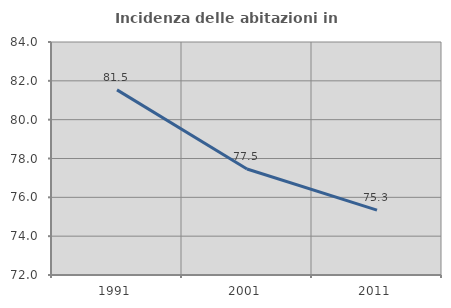
| Category | Incidenza delle abitazioni in proprietà  |
|---|---|
| 1991.0 | 81.534 |
| 2001.0 | 77.46 |
| 2011.0 | 75.34 |